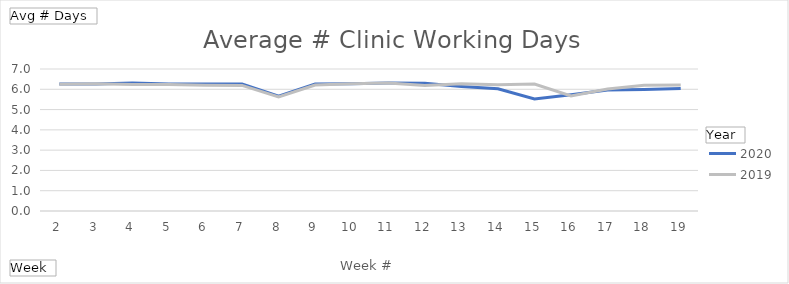
| Category | 2020 | 2019 |
|---|---|---|
| 2 | 6.257 | 6.248 |
| 3 | 6.257 | 6.276 |
| 4 | 6.305 | 6.238 |
| 5 | 6.267 | 6.238 |
| 6 | 6.267 | 6.2 |
| 7 | 6.257 | 6.19 |
| 8 | 5.657 | 5.629 |
| 9 | 6.267 | 6.21 |
| 10 | 6.276 | 6.276 |
| 11 | 6.305 | 6.305 |
| 12 | 6.295 | 6.19 |
| 13 | 6.143 | 6.276 |
| 14 | 6.029 | 6.219 |
| 15 | 5.519 | 6.257 |
| 16 | 5.725 | 5.676 |
| 17 | 5.961 | 6.01 |
| 18 | 5.99 | 6.2 |
| 19 | 6.04 | 6.21 |